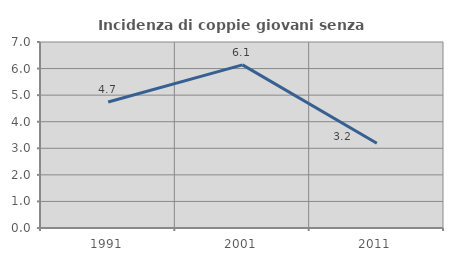
| Category | Incidenza di coppie giovani senza figli |
|---|---|
| 1991.0 | 4.741 |
| 2001.0 | 6.14 |
| 2011.0 | 3.189 |